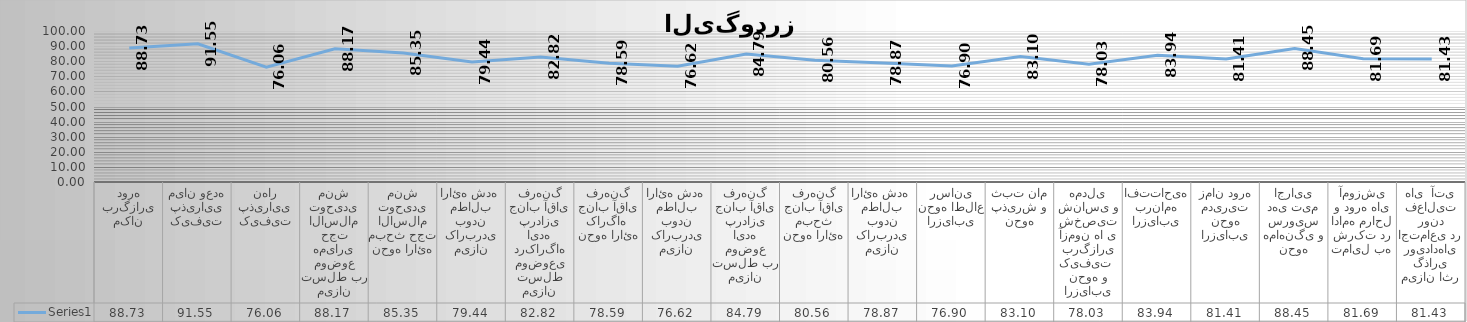
| Category | Series 0 |
|---|---|
| مکان برگزاری دوره | 88.732 |
| کیفیت پذیرایی میان وعده | 91.549 |
| کیفیت پذیرایی نهار | 76.056 |
| میزان تسلط بر موضوع همیاری حجت الاسلام توحیدی منش | 88.169 |
| نحوه ارائه مبحث حجت الاسلام توحیدی منش | 85.352 |
| میزان کاربردی بودن مطالب ارائه شده  | 79.437 |
| میزان تسلط موضوعی درکارگاه ایده پردازی جناب آقای فرهنگ | 82.817 |
| نحوه ارائه کارگاه  جناب آقای فرهنگ | 78.592 |
| میزان کاربردی بودن مطالب ارائه شده  | 76.62 |
| میزان تسلط بر موضوع ایده پردازی جناب آقای فرهنگ | 84.789 |
| نحوه ارائه مبحث جناب آقای فرهنگ | 80.563 |
| میزان کاربردی بودن مطالب ارائه شده  | 78.873 |
| ارزیابی نحوه اطلاع رسانی | 76.901 |
| نحوه پذیرش و ثبت نام | 83.099 |
| ارزیابی نحوه و کیفیت  برگزاری آزمون ها ی شخصیت شناسی و همدلی | 78.028 |
| ارزیابی برنامه افتتاحیه  | 83.944 |
| ارزیابی نحوه مدیریت زمان دوره | 81.408 |
| نحوه هماهنگی و سرویس دهی تیم اجرایی | 88.451 |
| تمایل به شرکت در ادامه مراحل و دوره های آموزشی | 81.69 |
| میزان اثر گذاری رویدادهای اجتماعی در روند فعالیت های  آتی | 81.429 |